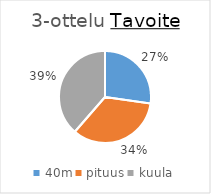
| Category | Series 0 |
|---|---|
| 40m | 218 |
| pituus | 273 |
| kuula | 309 |